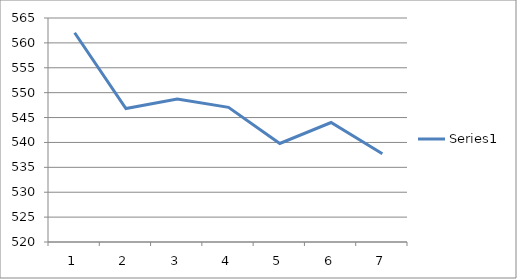
| Category | Series 0 |
|---|---|
| 0 | 562.038 |
| 1 | 546.818 |
| 2 | 548.721 |
| 3 | 547.045 |
| 4 | 539.787 |
| 5 | 544.009 |
| 6 | 537.734 |